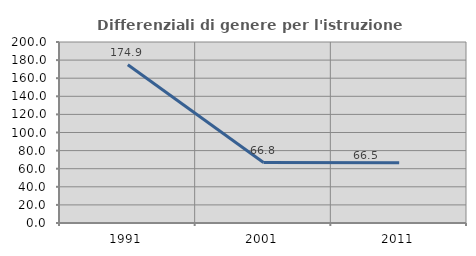
| Category | Differenziali di genere per l'istruzione superiore |
|---|---|
| 1991.0 | 174.876 |
| 2001.0 | 66.82 |
| 2011.0 | 66.49 |